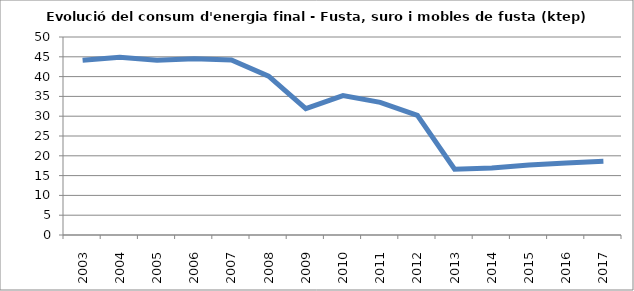
| Category | 44,1 44,9 44,1 44,5 44,2 40,1 31,9 35,2 33,5 30,2 16,6 16,9 17,7 18,2 18,6 |
|---|---|
| 2003.0 | 44.1 |
| 2004.0 | 44.9 |
| 2005.0 | 44.1 |
| 2006.0 | 44.5 |
| 2007.0 | 44.2 |
| 2008.0 | 40.1 |
| 2009.0 | 31.9 |
| 2010.0 | 35.2 |
| 2011.0 | 33.5 |
| 2012.0 | 30.2 |
| 2013.0 | 16.6 |
| 2014.0 | 16.9 |
| 2015.0 | 17.7 |
| 2016.0 | 18.2 |
| 2017.0 | 18.6 |